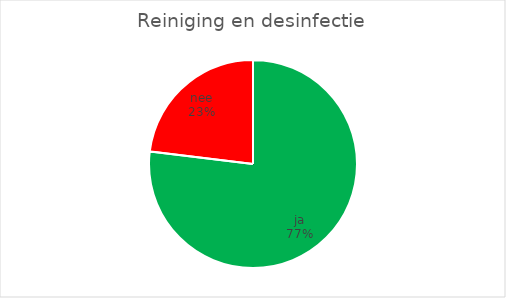
| Category | Reiniging en desinfectie |
|---|---|
| ja | 10 |
| nee | 3 |